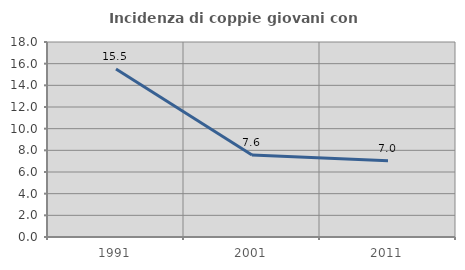
| Category | Incidenza di coppie giovani con figli |
|---|---|
| 1991.0 | 15.504 |
| 2001.0 | 7.576 |
| 2011.0 | 7.037 |